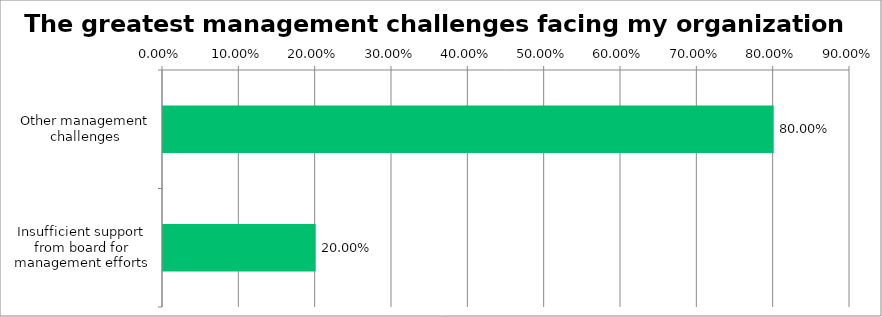
| Category | Responses |
|---|---|
| Other management challenges | 0.8 |
| Insufficient support from board for management efforts | 0.2 |